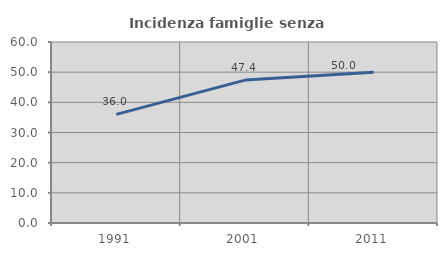
| Category | Incidenza famiglie senza nuclei |
|---|---|
| 1991.0 | 36 |
| 2001.0 | 47.368 |
| 2011.0 | 50 |